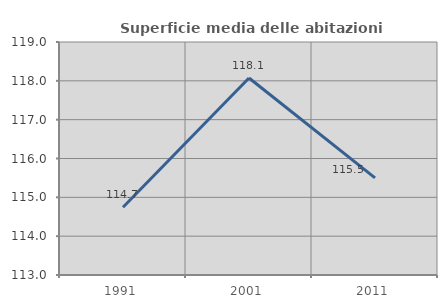
| Category | Superficie media delle abitazioni occupate |
|---|---|
| 1991.0 | 114.746 |
| 2001.0 | 118.074 |
| 2011.0 | 115.5 |